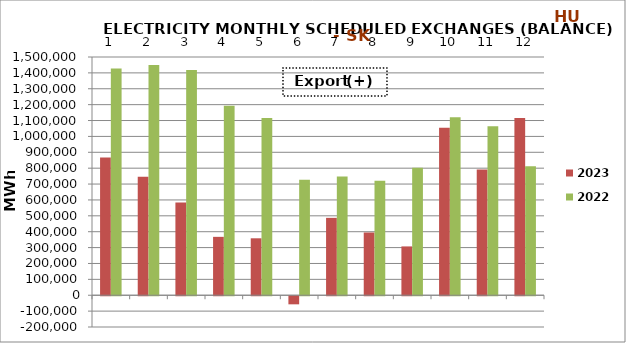
| Category | 2023 | 2022 |
|---|---|---|
| 0 | 867906.05 | 1427269.4 |
| 1 | 745628.775 | 1449616.4 |
| 2 | 584533.925 | 1418433.3 |
| 3 | 367608 | 1193446.2 |
| 4 | 358495.175 | 1115427.9 |
| 5 | -50962.2 | 726641.6 |
| 6 | 487187.725 | 748162.1 |
| 7 | 394976.725 | 721148.9 |
| 8 | 307367.225 | 802188.7 |
| 9 | 1053979.75 | 1119913.9 |
| 10 | 791291.8 | 1063413.375 |
| 11 | 1116586.8 | 812903.225 |